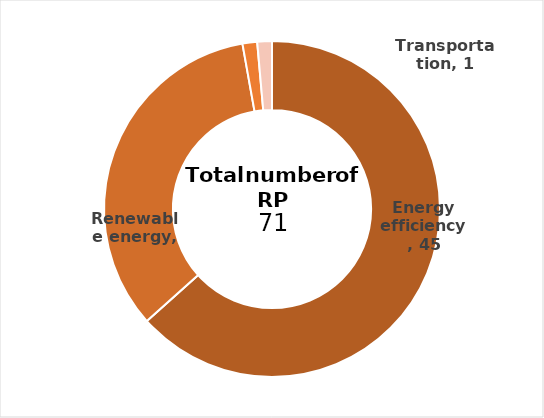
| Category | Series 0 |
|---|---|
| 0 | 45 |
| 1 | 24 |
| 2 | 1 |
| 3 | 1 |